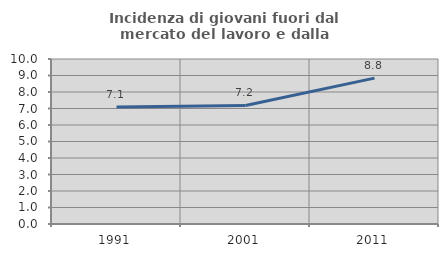
| Category | Incidenza di giovani fuori dal mercato del lavoro e dalla formazione  |
|---|---|
| 1991.0 | 7.087 |
| 2001.0 | 7.184 |
| 2011.0 | 8.842 |